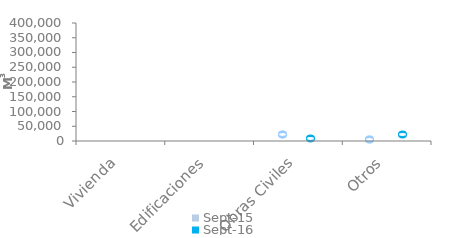
| Category | sep-15 | sep-16 |
|---|---|---|
| Vivienda | 0 | 0 |
| Edificaciones | 0 | 0 |
| Obras Civiles | 0 | 0 |
| Otros | 0 | 0 |